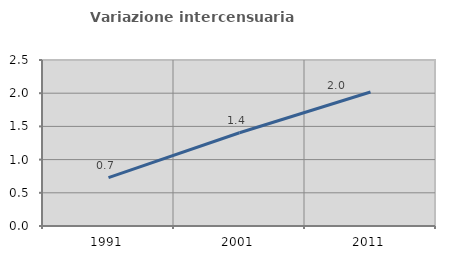
| Category | Variazione intercensuaria annua |
|---|---|
| 1991.0 | 0.729 |
| 2001.0 | 1.404 |
| 2011.0 | 2.018 |